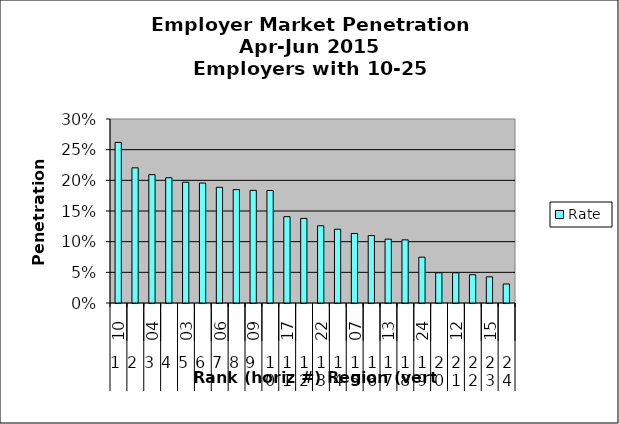
| Category | Rate |
|---|---|
| 0 | 0.262 |
| 1 | 0.22 |
| 2 | 0.209 |
| 3 | 0.204 |
| 4 | 0.197 |
| 5 | 0.196 |
| 6 | 0.189 |
| 7 | 0.185 |
| 8 | 0.184 |
| 9 | 0.183 |
| 10 | 0.141 |
| 11 | 0.138 |
| 12 | 0.126 |
| 13 | 0.12 |
| 14 | 0.113 |
| 15 | 0.11 |
| 16 | 0.104 |
| 17 | 0.103 |
| 18 | 0.075 |
| 19 | 0.049 |
| 20 | 0.049 |
| 21 | 0.046 |
| 22 | 0.043 |
| 23 | 0.031 |